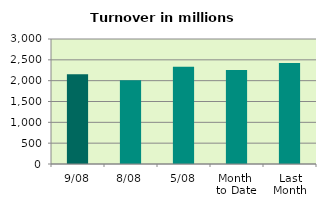
| Category | Series 0 |
|---|---|
| 9/08 | 2154.582 |
| 8/08 | 2007.125 |
| 5/08 | 2331.573 |
| Month 
to Date | 2253.082 |
| Last
Month | 2421.628 |